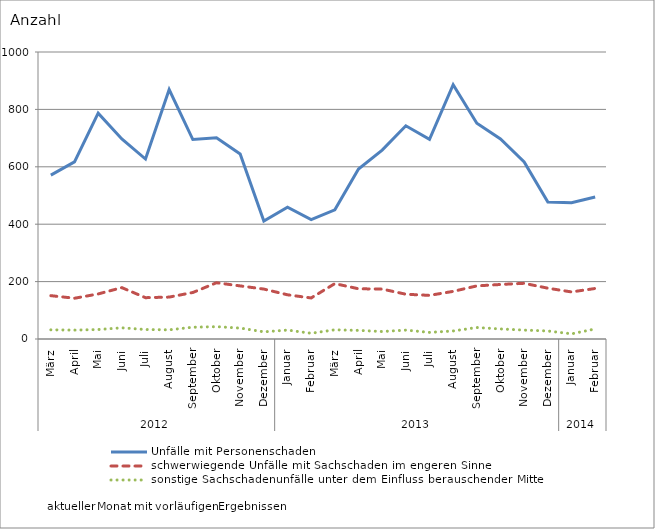
| Category | Unfälle mit Personenschaden | schwerwiegende Unfälle mit Sachschaden im engeren Sinne | sonstige Sachschadenunfälle unter dem Einfluss berauschender Mittel |
|---|---|---|---|
| 0 | 571 | 151 | 32 |
| 1 | 617 | 142 | 31 |
| 2 | 787 | 157 | 33 |
| 3 | 697 | 179 | 39 |
| 4 | 627 | 144 | 33 |
| 5 | 869 | 146 | 32 |
| 6 | 695 | 162 | 41 |
| 7 | 701 | 196 | 43 |
| 8 | 645 | 185 | 38 |
| 9 | 411 | 174 | 25 |
| 10 | 459 | 154 | 31 |
| 11 | 416 | 143 | 20 |
| 12 | 450 | 193 | 32 |
| 13 | 592 | 175 | 30 |
| 14 | 658 | 174 | 26 |
| 15 | 743 | 156 | 31 |
| 16 | 696 | 152 | 23 |
| 17 | 886 | 166 | 28 |
| 18 | 752 | 185 | 40 |
| 19 | 697 | 190 | 35 |
| 20 | 617 | 194 | 31 |
| 21 | 477 | 177 | 28 |
| 22 | 475 | 164 | 18 |
| 23 | 495 | 176 | 35 |